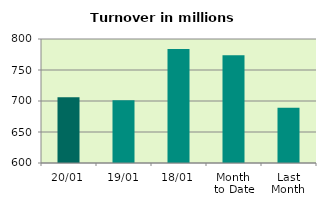
| Category | Series 0 |
|---|---|
| 20/01 | 706.031 |
| 19/01 | 701.15 |
| 18/01 | 784.05 |
| Month 
to Date | 773.863 |
| Last
Month | 689.27 |